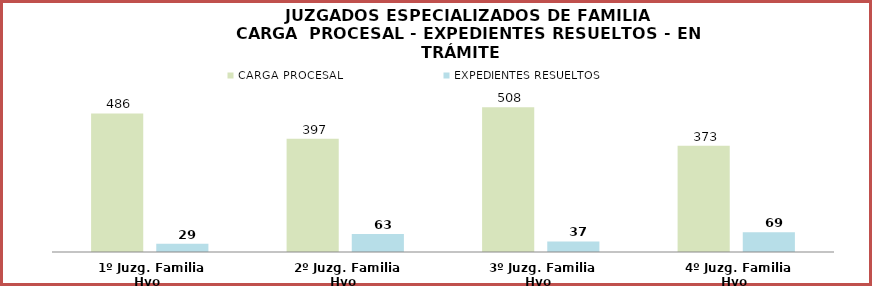
| Category | CARGA PROCESAL | EXPEDIENTES RESUELTOS |
|---|---|---|
| 1º Juzg. Familia Hyo | 486 | 29 |
| 2º Juzg. Familia Hyo | 397 | 63 |
| 3º Juzg. Familia Hyo | 508 | 37 |
| 4º Juzg. Familia Hyo | 373 | 69 |